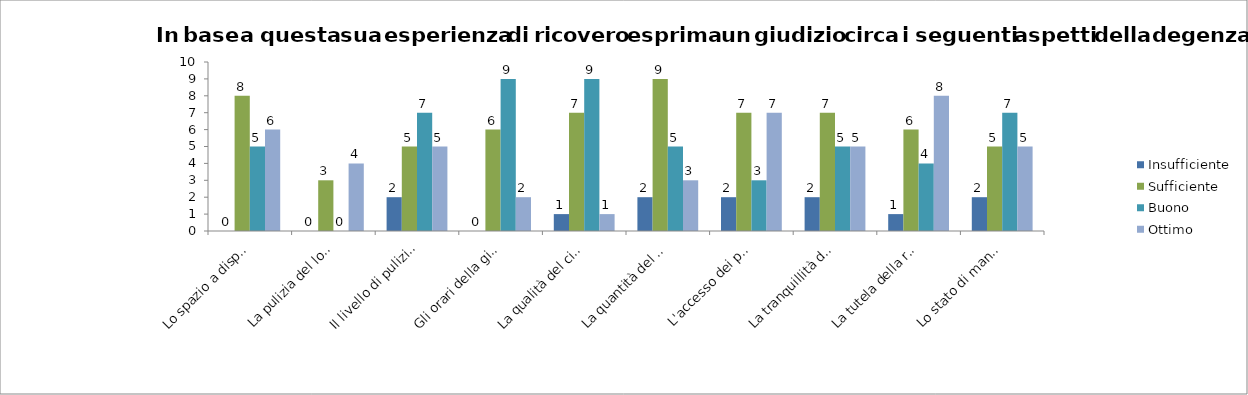
| Category | Insufficiente | Sufficiente | Buono | Ottimo |
|---|---|---|---|---|
| Lo spazio a disposizione | 0 | 8 | 5 | 6 |
| La pulizia del locale di ricovero | 0 | 3 | 0 | 4 |
| Il livello di pulizia dei servizi igienici | 2 | 5 | 7 | 5 |
| Gli orari della giornata (sveglia, pasti, ecc) | 0 | 6 | 9 | 2 |
| La qualità del cibo | 1 | 7 | 9 | 1 |
| La quantità del cibo | 2 | 9 | 5 | 3 |
| L'accesso dei parenti | 2 | 7 | 3 | 7 |
| La tranquillità del locale di ricovero | 2 | 7 | 5 | 5 |
| La tutela della riservatezza (privacy) | 1 | 6 | 4 | 8 |
| Lo stato di manutenzione dei locali di ricovero | 2 | 5 | 7 | 5 |